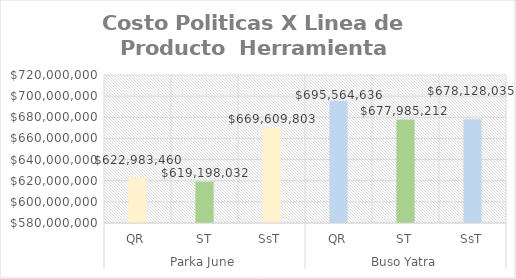
| Category | Series 0 |
|---|---|
| 0 | 622983459.934 |
| 1 | 619198032.303 |
| 2 | 669609802.841 |
| 3 | 695564635.641 |
| 4 | 677985211.827 |
| 5 | 678128034.578 |